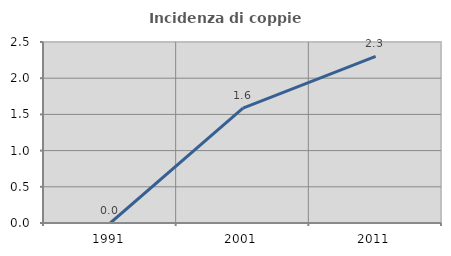
| Category | Incidenza di coppie miste |
|---|---|
| 1991.0 | 0 |
| 2001.0 | 1.587 |
| 2011.0 | 2.3 |